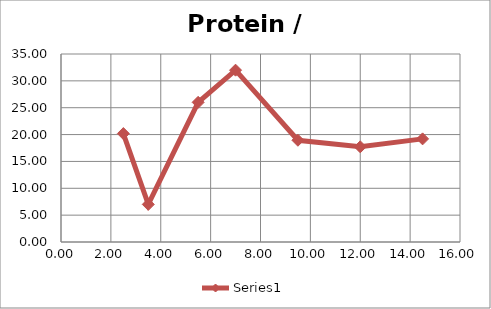
| Category | Series 0 |
|---|---|
| 2.5 | 20.184 |
| 3.5 | 7 |
| 5.5 | 26 |
| 7.0 | 31.987 |
| 9.5 | 18.944 |
| 12.0 | 17.72 |
| 14.5 | 19.2 |